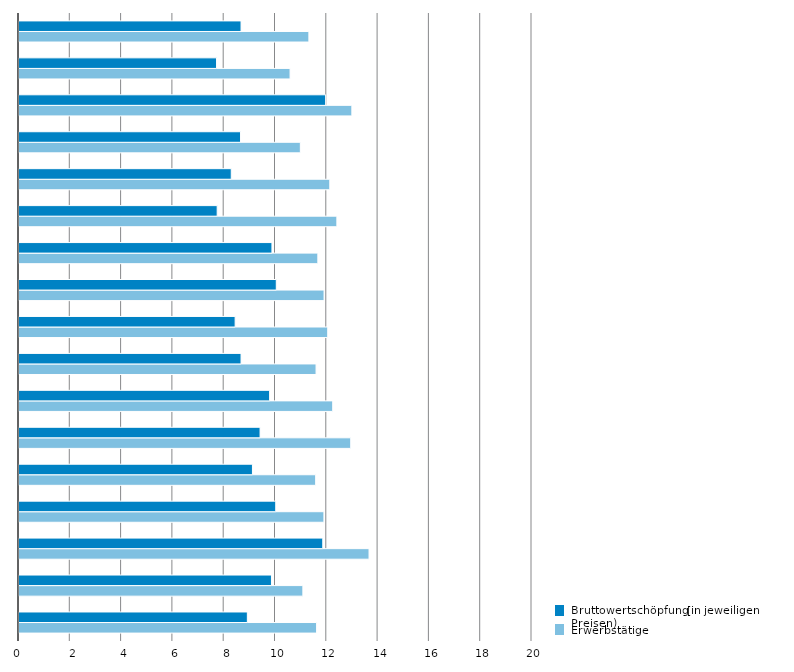
| Category | Erwerbstätige | Bruttowertschöpfung (in jeweiligen Preisen) |
|---|---|---|
| 0 | 11.603 | 8.902 |
| 1 | 11.067 | 9.842 |
| 2 | 13.647 | 11.843 |
| 3 | 11.888 | 10.01 |
| 4 | 11.566 | 9.101 |
| 5 | 12.933 | 9.398 |
| 6 | 12.23 | 9.771 |
| 7 | 11.581 | 8.657 |
| 8 | 12.036 | 8.426 |
| 9 | 11.893 | 10.031 |
| 10 | 11.651 | 9.861 |
| 11 | 12.392 | 7.726 |
| 12 | 12.116 | 8.275 |
| 13 | 10.969 | 8.637 |
| 14 | 12.977 | 11.955 |
| 15 | 10.568 | 7.702 |
| 16 | 11.301 | 8.657 |